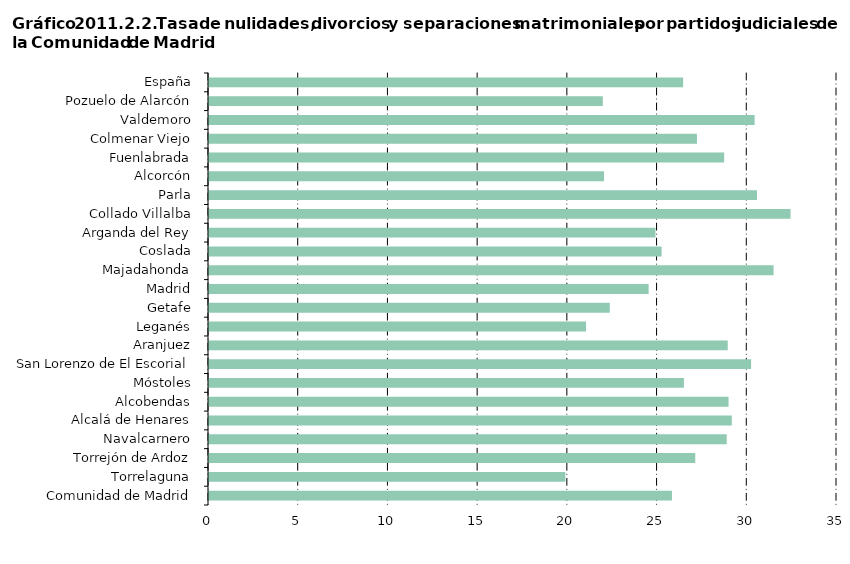
| Category | Series 0 |
|---|---|
| Comunidad de Madrid | 25.801 |
|     Torrelaguna | 19.86 |
|     Torrejón de Ardoz | 27.1 |
|     Navalcarnero | 28.855 |
|     Alcalá de Henares | 29.138 |
|     Alcobendas | 28.958 |
|     Móstoles | 26.47 |
|     San Lorenzo de El Escorial | 30.213 |
|     Aranjuez | 28.909 |
|     Leganés | 21.013 |
|     Getafe | 22.338 |
|     Madrid | 24.502 |
|     Majadahonda | 31.465 |
|     Coslada | 25.222 |
|     Arganda del Rey | 24.882 |
|     Collado Villalba | 32.411 |
|     Parla | 30.542 |
|     Alcorcón | 22.015 |
|     Fuenlabrada | 28.712 |
|     Colmenar Viejo | 27.194 |
|     Valdemoro | 30.409 |
|     Pozuelo de Alarcón | 21.95 |
| España | 26.425 |